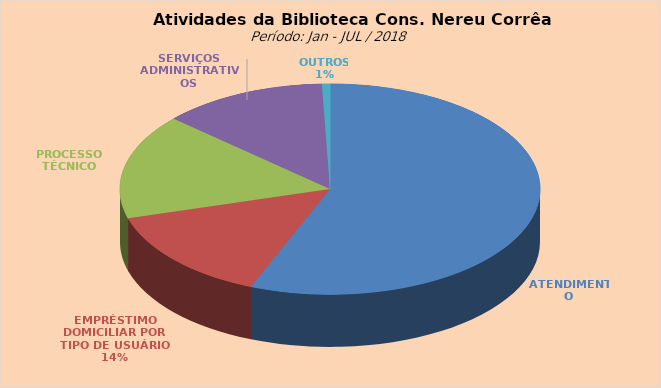
| Category | Series 0 |
|---|---|
| ATENDIMENTO | 7892 |
| EMPRÉSTIMO DOMICILIAR POR TIPO DE USUÁRIO | 2022 |
| PROCESSO TÉCNICO | 2269 |
| SERVIÇOS ADMINISTRATIVOS | 1790 |
| OUTROS | 87 |